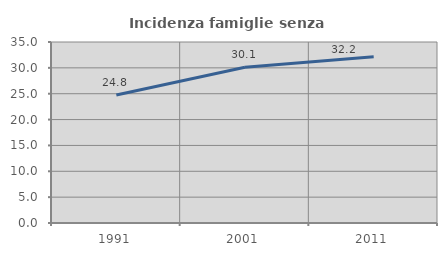
| Category | Incidenza famiglie senza nuclei |
|---|---|
| 1991.0 | 24.753 |
| 2001.0 | 30.102 |
| 2011.0 | 32.165 |